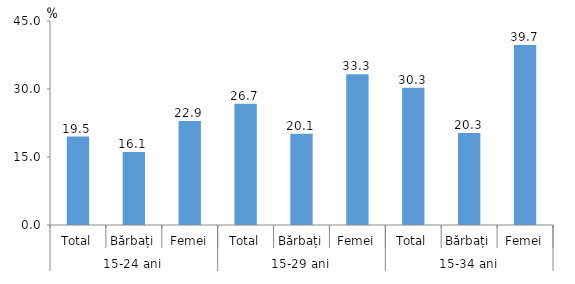
| Category | Series 0 |
|---|---|
| 0 | 19.497 |
| 1 | 16.088 |
| 2 | 22.949 |
| 3 | 26.744 |
| 4 | 20.142 |
| 5 | 33.259 |
| 6 | 30.262 |
| 7 | 20.282 |
| 8 | 39.733 |